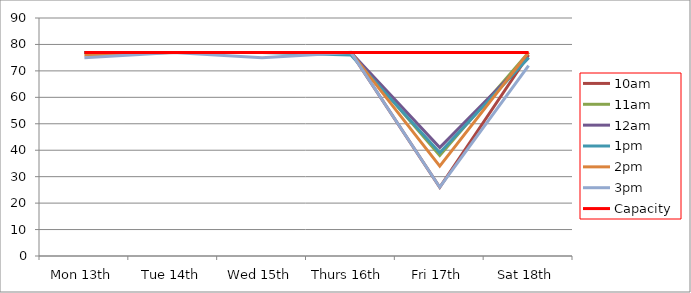
| Category | 9am | 10am | 11am | 12am | 1pm | 2pm | 3pm | 4pm | 5pm | Capacity |
|---|---|---|---|---|---|---|---|---|---|---|
| Mon 13th |  | 77 | 77 | 77 | 77 | 76 | 75 |  |  | 77 |
| Tue 14th |  | 77 | 77 | 77 | 77 | 77 | 77 |  |  | 77 |
| Wed 15th |  | 77 | 77 | 77 | 77 | 77 | 75 |  |  | 77 |
| Thurs 16th |  | 77 | 77 | 77 | 76 | 77 | 77 |  |  | 77 |
| Fri 17th |  | 26 | 38 | 41 | 39 | 34 | 26 |  |  | 77 |
| Sat 18th |  | 76 | 77 | 75 | 75 | 77 | 72 |  |  | 77 |